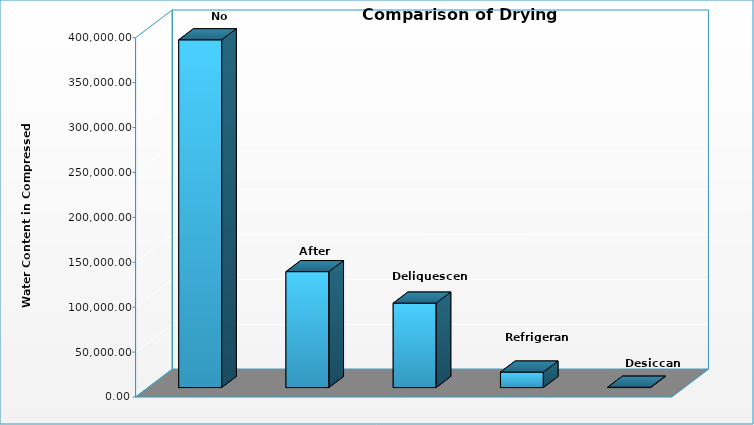
| Category | Series 0 |
|---|---|
| No Treatment | 387175.105 |
| After Cooler | 129063.079 |
| Deliquescent | 93981.774 |
| Refrigerant | 17217.796 |
| Desiccant | 369.559 |